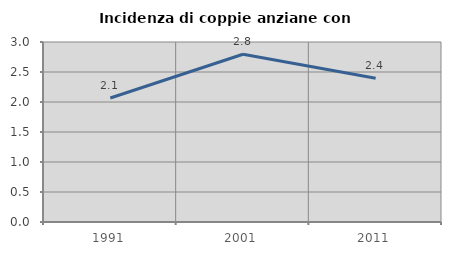
| Category | Incidenza di coppie anziane con figli |
|---|---|
| 1991.0 | 2.067 |
| 2001.0 | 2.795 |
| 2011.0 | 2.397 |